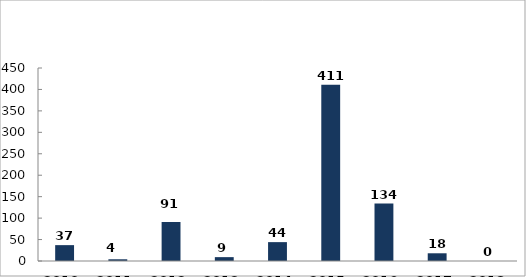
| Category | Tiltott határátlépés és kísérlete szabálysértés |
|---|---|
| 2010. év | 37 |
| 2011. év | 4 |
| 2012. év | 91 |
| 2013. év | 9 |
| 2014. év | 44 |
| 2015. év | 411 |
| 2016. év | 134 |
| 2017. év | 18 |
| 2018. év | 0 |